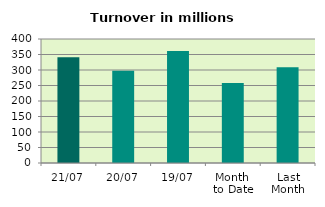
| Category | Series 0 |
|---|---|
| 21/07 | 340.727 |
| 20/07 | 297.721 |
| 19/07 | 361.299 |
| Month 
to Date | 258.036 |
| Last
Month | 308.534 |